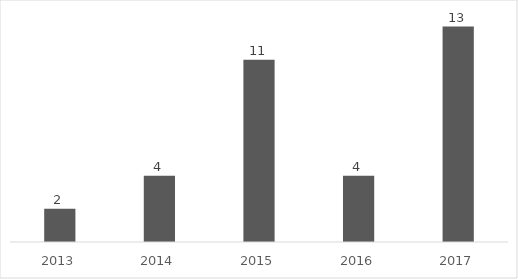
| Category | Artigos |
|---|---|
| 2013.0 | 2 |
| 2014.0 | 4 |
| 2015.0 | 11 |
| 2016.0 | 4 |
| 2017.0 | 13 |